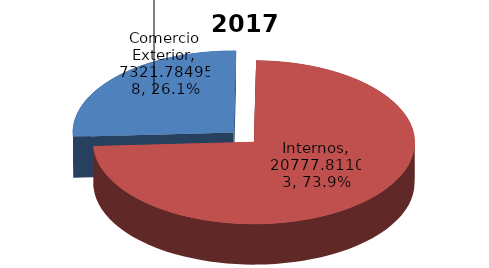
| Category | Series 0 |
|---|---|
| Comercio Exterior | 7321.785 |
| Internos | 20777.811 |